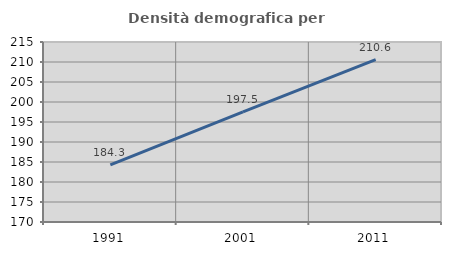
| Category | Densità demografica |
|---|---|
| 1991.0 | 184.277 |
| 2001.0 | 197.532 |
| 2011.0 | 210.595 |